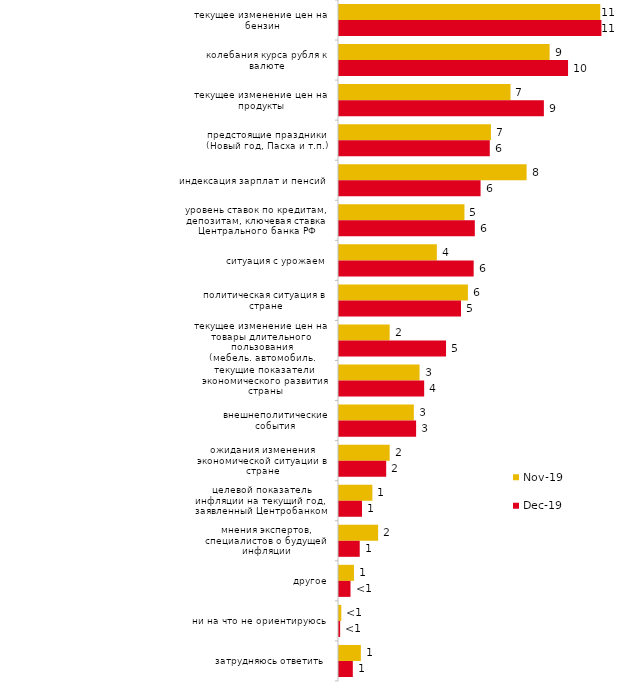
| Category | ноя.19 | дек.19 |
|---|---|---|
| текущее изменение цен на бензин | 11.238 | 11.287 |
| колебания курса рубля к валюте | 9.059 | 9.851 |
| текущее изменение цен на продукты | 7.376 | 8.812 |
| предстоящие праздники (Новый год, Пасха и т.п.) | 6.535 | 6.485 |
| индексация зарплат и пенсий | 8.069 | 6.089 |
| уровень ставок по кредитам, депозитам, ключевая ставка Центрального банка РФ | 5.396 | 5.842 |
| ситуация с урожаем | 4.208 | 5.792 |
| политическая ситуация в стране | 5.545 | 5.248 |
| текущее изменение цен на товары длительного пользования (мебель, автомобиль, бытовая техника и т.п.) | 2.178 | 4.604 |
| текущие показатели экономического развития страны | 3.465 | 3.663 |
| внешнеполитические события | 3.218 | 3.317 |
| ожидания изменения экономической ситуации в стране | 2.178 | 2.03 |
| целевой показатель инфляции на текущий год, заявленный Центробанком | 1.436 | 0.99 |
| мнения экспертов, специалистов о будущей инфляции | 1.683 | 0.891 |
| другое | 0.644 | 0.495 |
| ни на что не ориентируюсь | 0.099 | 0.05 |
| затрудняюсь ответить | 0.941 | 0.594 |